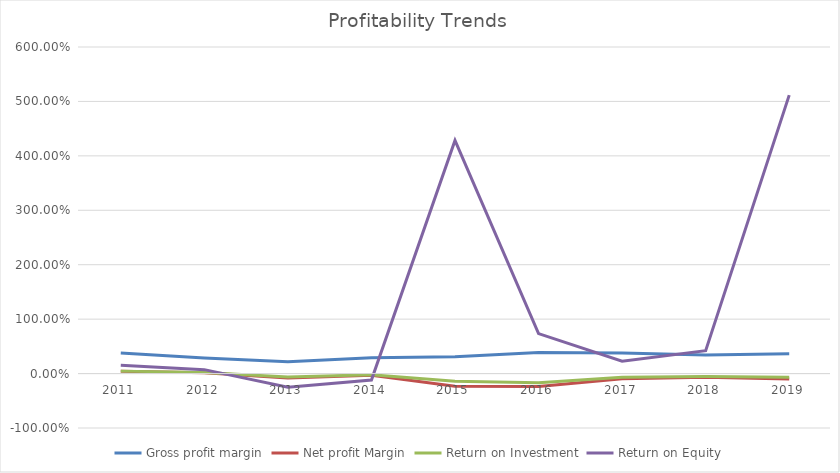
| Category | Gross profit margin | Net profit Margin | Return on Investment | Return on Equity |
|---|---|---|---|---|
| 2011.0 | 0.378 | 0.041 | 0.045 | 0.153 |
| 2012.0 | 0.284 | 0.015 | 0.021 | 0.072 |
| 2013.0 | 0.219 | -0.08 | -0.064 | -0.252 |
| 2014.0 | 0.29 | -0.032 | -0.023 | -0.12 |
| 2015.0 | 0.31 | -0.234 | -0.141 | 4.284 |
| 2016.0 | 0.388 | -0.237 | -0.168 | 0.734 |
| 2017.0 | 0.378 | -0.097 | -0.07 | 0.227 |
| 2018.0 | 0.343 | -0.066 | -0.055 | 0.421 |
| 2019.0 | 0.366 | -0.102 | -0.066 | 5.116 |